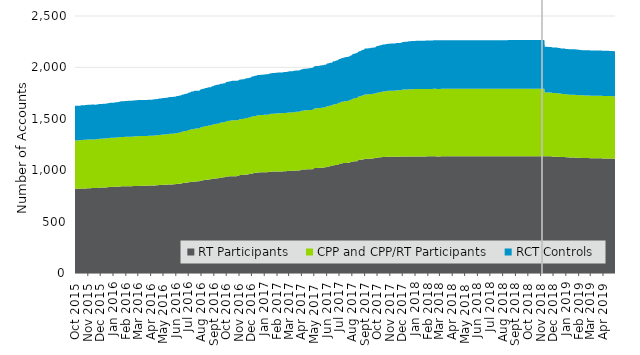
| Category | RT Participants | CPP and CPP/RT Participants | RCT Controls |
|---|---|---|---|
| 2015-10-01 | 819 | 470 | 337 |
| 2015-10-02 | 819 | 470 | 337 |
| 2015-10-03 | 820 | 470 | 337 |
| 2015-10-04 | 820 | 470 | 337 |
| 2015-10-05 | 819 | 470 | 337 |
| 2015-10-06 | 819 | 470 | 337 |
| 2015-10-07 | 820 | 470 | 337 |
| 2015-10-08 | 820 | 470 | 337 |
| 2015-10-09 | 821 | 470 | 337 |
| 2015-10-10 | 821 | 470 | 337 |
| 2015-10-11 | 821 | 470 | 337 |
| 2015-10-12 | 821 | 470 | 337 |
| 2015-10-13 | 821 | 470 | 337 |
| 2015-10-14 | 821 | 470 | 337 |
| 2015-10-15 | 822 | 470 | 337 |
| 2015-10-16 | 822 | 472 | 337 |
| 2015-10-17 | 822 | 472 | 337 |
| 2015-10-18 | 822 | 472 | 337 |
| 2015-10-19 | 822 | 472 | 337 |
| 2015-10-20 | 822 | 472 | 337 |
| 2015-10-21 | 823 | 472 | 337 |
| 2015-10-22 | 823 | 472 | 337 |
| 2015-10-23 | 823 | 472 | 337 |
| 2015-10-24 | 823 | 473 | 337 |
| 2015-10-25 | 823 | 473 | 337 |
| 2015-10-26 | 823 | 473 | 337 |
| 2015-10-27 | 823 | 473 | 338 |
| 2015-10-28 | 823 | 473 | 338 |
| 2015-10-29 | 823 | 473 | 338 |
| 2015-10-30 | 823 | 473 | 338 |
| 2015-10-31 | 825 | 473 | 338 |
| 2015-11-01 | 825 | 473 | 338 |
| 2015-11-02 | 825 | 473 | 338 |
| 2015-11-03 | 825 | 473 | 339 |
| 2015-11-04 | 825 | 473 | 339 |
| 2015-11-05 | 825 | 473 | 339 |
| 2015-11-06 | 825 | 473 | 339 |
| 2015-11-07 | 825 | 473 | 339 |
| 2015-11-08 | 825 | 473 | 339 |
| 2015-11-09 | 825 | 473 | 339 |
| 2015-11-10 | 826 | 473 | 339 |
| 2015-11-11 | 826 | 473 | 339 |
| 2015-11-12 | 826 | 473 | 339 |
| 2015-11-13 | 826 | 473 | 339 |
| 2015-11-14 | 826 | 473 | 339 |
| 2015-11-15 | 826 | 473 | 339 |
| 2015-11-16 | 826 | 473 | 339 |
| 2015-11-17 | 826 | 473 | 339 |
| 2015-11-18 | 826 | 473 | 338 |
| 2015-11-19 | 826 | 473 | 338 |
| 2015-11-20 | 826 | 473 | 338 |
| 2015-11-21 | 826 | 474 | 338 |
| 2015-11-22 | 826 | 474 | 338 |
| 2015-11-23 | 826 | 474 | 338 |
| 2015-11-24 | 826 | 474 | 338 |
| 2015-11-25 | 827 | 474 | 338 |
| 2015-11-26 | 829 | 474 | 338 |
| 2015-11-27 | 830 | 474 | 338 |
| 2015-11-28 | 830 | 475 | 338 |
| 2015-11-29 | 830 | 475 | 338 |
| 2015-11-30 | 830 | 475 | 338 |
| 2015-12-01 | 831 | 476 | 338 |
| 2015-12-02 | 831 | 476 | 338 |
| 2015-12-03 | 831 | 476 | 338 |
| 2015-12-04 | 831 | 476 | 338 |
| 2015-12-05 | 831 | 476 | 338 |
| 2015-12-06 | 831 | 476 | 338 |
| 2015-12-07 | 831 | 476 | 338 |
| 2015-12-08 | 832 | 476 | 339 |
| 2015-12-09 | 832 | 476 | 339 |
| 2015-12-10 | 832 | 476 | 339 |
| 2015-12-11 | 832 | 476 | 339 |
| 2015-12-12 | 832 | 476 | 339 |
| 2015-12-13 | 832 | 476 | 339 |
| 2015-12-14 | 832 | 476 | 339 |
| 2015-12-15 | 832 | 476 | 339 |
| 2015-12-16 | 833 | 476 | 339 |
| 2015-12-17 | 834 | 476 | 339 |
| 2015-12-18 | 835 | 476 | 339 |
| 2015-12-19 | 835 | 477 | 339 |
| 2015-12-20 | 835 | 477 | 339 |
| 2015-12-21 | 835 | 477 | 339 |
| 2015-12-22 | 836 | 477 | 340 |
| 2015-12-23 | 836 | 477 | 340 |
| 2015-12-24 | 837 | 477 | 341 |
| 2015-12-25 | 838 | 477 | 341 |
| 2015-12-26 | 838 | 477 | 341 |
| 2015-12-27 | 838 | 477 | 341 |
| 2015-12-28 | 838 | 477 | 341 |
| 2015-12-29 | 838 | 477 | 341 |
| 2015-12-30 | 838 | 477 | 341 |
| 2015-12-31 | 838 | 477 | 341 |
| 2016-01-01 | 838 | 477 | 341 |
| 2016-01-02 | 838 | 477 | 341 |
| 2016-01-03 | 838 | 477 | 341 |
| 2016-01-04 | 838 | 477 | 341 |
| 2016-01-05 | 839 | 477 | 343 |
| 2016-01-06 | 839 | 477 | 344 |
| 2016-01-07 | 839 | 477 | 344 |
| 2016-01-08 | 839 | 478 | 344 |
| 2016-01-09 | 839 | 479 | 344 |
| 2016-01-10 | 839 | 479 | 344 |
| 2016-01-11 | 839 | 479 | 344 |
| 2016-01-12 | 839 | 479 | 344 |
| 2016-01-13 | 839 | 479 | 344 |
| 2016-01-14 | 840 | 479 | 344 |
| 2016-01-15 | 840 | 480 | 344 |
| 2016-01-16 | 841 | 481 | 345 |
| 2016-01-17 | 841 | 481 | 345 |
| 2016-01-18 | 841 | 481 | 345 |
| 2016-01-19 | 842 | 481 | 346 |
| 2016-01-20 | 843 | 481 | 346 |
| 2016-01-21 | 843 | 481 | 347 |
| 2016-01-22 | 843 | 481 | 347 |
| 2016-01-23 | 843 | 481 | 347 |
| 2016-01-24 | 843 | 481 | 347 |
| 2016-01-25 | 843 | 481 | 347 |
| 2016-01-26 | 843 | 481 | 347 |
| 2016-01-27 | 843 | 481 | 347 |
| 2016-01-28 | 843 | 481 | 347 |
| 2016-01-29 | 843 | 481 | 347 |
| 2016-01-30 | 843 | 482 | 349 |
| 2016-01-31 | 843 | 482 | 349 |
| 2016-02-01 | 843 | 482 | 349 |
| 2016-02-02 | 843 | 482 | 349 |
| 2016-02-03 | 843 | 482 | 349 |
| 2016-02-04 | 843 | 482 | 349 |
| 2016-02-05 | 843 | 482 | 349 |
| 2016-02-06 | 844 | 482 | 349 |
| 2016-02-07 | 844 | 482 | 349 |
| 2016-02-08 | 844 | 482 | 349 |
| 2016-02-09 | 844 | 482 | 349 |
| 2016-02-10 | 844 | 482 | 349 |
| 2016-02-11 | 844 | 482 | 349 |
| 2016-02-12 | 844 | 482 | 350 |
| 2016-02-13 | 844 | 482 | 350 |
| 2016-02-14 | 844 | 482 | 350 |
| 2016-02-15 | 844 | 482 | 350 |
| 2016-02-16 | 844 | 482 | 350 |
| 2016-02-17 | 845 | 482 | 350 |
| 2016-02-18 | 846 | 482 | 350 |
| 2016-02-19 | 846 | 482 | 350 |
| 2016-02-20 | 846 | 482 | 350 |
| 2016-02-21 | 846 | 482 | 350 |
| 2016-02-22 | 846 | 482 | 350 |
| 2016-02-23 | 847 | 482 | 350 |
| 2016-02-24 | 847 | 483 | 350 |
| 2016-02-25 | 847 | 483 | 350 |
| 2016-02-26 | 847 | 483 | 351 |
| 2016-02-27 | 847 | 483 | 351 |
| 2016-02-28 | 847 | 483 | 351 |
| 2016-02-29 | 847 | 483 | 351 |
| 2016-03-01 | 847 | 484 | 351 |
| 2016-03-02 | 847 | 484 | 351 |
| 2016-03-03 | 847 | 484 | 351 |
| 2016-03-04 | 847 | 484 | 351 |
| 2016-03-05 | 848 | 484 | 351 |
| 2016-03-06 | 848 | 484 | 351 |
| 2016-03-07 | 848 | 484 | 351 |
| 2016-03-08 | 848 | 484 | 351 |
| 2016-03-09 | 848 | 484 | 351 |
| 2016-03-10 | 848 | 484 | 351 |
| 2016-03-11 | 848 | 484 | 351 |
| 2016-03-12 | 848 | 484 | 351 |
| 2016-03-13 | 848 | 484 | 351 |
| 2016-03-14 | 848 | 484 | 351 |
| 2016-03-15 | 848 | 484 | 351 |
| 2016-03-16 | 848 | 484 | 351 |
| 2016-03-17 | 848 | 484 | 351 |
| 2016-03-18 | 848 | 484 | 351 |
| 2016-03-19 | 848 | 484 | 351 |
| 2016-03-20 | 848 | 484 | 351 |
| 2016-03-21 | 848 | 484 | 351 |
| 2016-03-22 | 848 | 484 | 351 |
| 2016-03-23 | 848 | 484 | 351 |
| 2016-03-24 | 848 | 484 | 351 |
| 2016-03-25 | 850 | 484 | 351 |
| 2016-03-26 | 850 | 484 | 351 |
| 2016-03-27 | 850 | 484 | 351 |
| 2016-03-28 | 850 | 484 | 351 |
| 2016-03-29 | 850 | 484 | 351 |
| 2016-03-30 | 850 | 484 | 351 |
| 2016-03-31 | 850 | 484 | 351 |
| 2016-04-01 | 851 | 484 | 351 |
| 2016-04-02 | 851 | 484 | 351 |
| 2016-04-03 | 851 | 484 | 351 |
| 2016-04-04 | 851 | 484 | 351 |
| 2016-04-05 | 851 | 484 | 351 |
| 2016-04-06 | 852 | 484 | 351 |
| 2016-04-07 | 852 | 484 | 351 |
| 2016-04-08 | 852 | 485 | 352 |
| 2016-04-09 | 852 | 485 | 352 |
| 2016-04-10 | 852 | 485 | 352 |
| 2016-04-11 | 852 | 485 | 352 |
| 2016-04-12 | 852 | 485 | 352 |
| 2016-04-13 | 852 | 485 | 352 |
| 2016-04-14 | 853 | 486 | 352 |
| 2016-04-15 | 853 | 486 | 352 |
| 2016-04-16 | 854 | 487 | 352 |
| 2016-04-17 | 854 | 487 | 352 |
| 2016-04-18 | 854 | 487 | 352 |
| 2016-04-19 | 854 | 487 | 353 |
| 2016-04-20 | 854 | 487 | 353 |
| 2016-04-21 | 856 | 487 | 353 |
| 2016-04-22 | 856 | 487 | 354 |
| 2016-04-23 | 856 | 487 | 354 |
| 2016-04-24 | 856 | 487 | 354 |
| 2016-04-25 | 856 | 487 | 354 |
| 2016-04-26 | 857 | 487 | 354 |
| 2016-04-27 | 857 | 487 | 354 |
| 2016-04-28 | 858 | 487 | 354 |
| 2016-04-29 | 858 | 488 | 354 |
| 2016-04-30 | 858 | 489 | 355 |
| 2016-05-01 | 858 | 489 | 355 |
| 2016-05-02 | 858 | 489 | 355 |
| 2016-05-03 | 858 | 489 | 355 |
| 2016-05-04 | 858 | 489 | 355 |
| 2016-05-05 | 858 | 489 | 355 |
| 2016-05-06 | 859 | 489 | 355 |
| 2016-05-07 | 859 | 489 | 356 |
| 2016-05-08 | 859 | 489 | 356 |
| 2016-05-09 | 859 | 489 | 356 |
| 2016-05-10 | 859 | 490 | 356 |
| 2016-05-11 | 859 | 490 | 356 |
| 2016-05-12 | 859 | 490 | 356 |
| 2016-05-13 | 860 | 491 | 356 |
| 2016-05-14 | 862 | 491 | 356 |
| 2016-05-15 | 862 | 491 | 356 |
| 2016-05-16 | 862 | 491 | 356 |
| 2016-05-17 | 862 | 493 | 357 |
| 2016-05-18 | 862 | 493 | 357 |
| 2016-05-19 | 862 | 493 | 357 |
| 2016-05-20 | 862 | 493 | 358 |
| 2016-05-21 | 862 | 493 | 358 |
| 2016-05-22 | 862 | 493 | 358 |
| 2016-05-23 | 862 | 493 | 358 |
| 2016-05-24 | 862 | 493 | 358 |
| 2016-05-25 | 862 | 493 | 358 |
| 2016-05-26 | 863 | 493 | 358 |
| 2016-05-27 | 863 | 493 | 358 |
| 2016-05-28 | 864 | 493 | 358 |
| 2016-05-29 | 864 | 493 | 358 |
| 2016-05-30 | 864 | 493 | 358 |
| 2016-05-31 | 864 | 493 | 358 |
| 2016-06-01 | 866 | 493 | 358 |
| 2016-06-02 | 866 | 495 | 359 |
| 2016-06-03 | 866 | 495 | 359 |
| 2016-06-04 | 867 | 495 | 359 |
| 2016-06-05 | 867 | 495 | 359 |
| 2016-06-06 | 867 | 495 | 359 |
| 2016-06-07 | 867 | 496 | 359 |
| 2016-06-08 | 867 | 497 | 359 |
| 2016-06-09 | 868 | 497 | 360 |
| 2016-06-10 | 868 | 498 | 360 |
| 2016-06-11 | 868 | 499 | 360 |
| 2016-06-12 | 868 | 499 | 360 |
| 2016-06-13 | 868 | 499 | 360 |
| 2016-06-14 | 869 | 499 | 360 |
| 2016-06-15 | 870 | 500 | 360 |
| 2016-06-16 | 873 | 501 | 360 |
| 2016-06-17 | 874 | 501 | 360 |
| 2016-06-18 | 875 | 501 | 360 |
| 2016-06-19 | 875 | 501 | 360 |
| 2016-06-20 | 875 | 501 | 360 |
| 2016-06-21 | 876 | 502 | 360 |
| 2016-06-22 | 877 | 503 | 360 |
| 2016-06-23 | 877 | 504 | 360 |
| 2016-06-24 | 877 | 504 | 362 |
| 2016-06-25 | 878 | 504 | 362 |
| 2016-06-26 | 878 | 504 | 362 |
| 2016-06-27 | 878 | 504 | 362 |
| 2016-06-28 | 879 | 504 | 362 |
| 2016-06-29 | 879 | 504 | 363 |
| 2016-06-30 | 881 | 505 | 363 |
| 2016-07-01 | 883 | 507 | 364 |
| 2016-07-02 | 883 | 507 | 364 |
| 2016-07-03 | 883 | 507 | 364 |
| 2016-07-04 | 883 | 507 | 364 |
| 2016-07-05 | 885 | 509 | 364 |
| 2016-07-06 | 885 | 510 | 364 |
| 2016-07-07 | 885 | 510 | 364 |
| 2016-07-08 | 886 | 511 | 366 |
| 2016-07-09 | 887 | 511 | 368 |
| 2016-07-10 | 887 | 511 | 368 |
| 2016-07-11 | 887 | 511 | 368 |
| 2016-07-12 | 887 | 511 | 368 |
| 2016-07-13 | 887 | 511 | 368 |
| 2016-07-14 | 887 | 512 | 368 |
| 2016-07-15 | 888 | 512 | 368 |
| 2016-07-16 | 890 | 514 | 368 |
| 2016-07-17 | 890 | 514 | 368 |
| 2016-07-18 | 890 | 514 | 368 |
| 2016-07-19 | 891 | 514 | 368 |
| 2016-07-20 | 891 | 514 | 368 |
| 2016-07-21 | 891 | 514 | 368 |
| 2016-07-22 | 891 | 514 | 368 |
| 2016-07-23 | 892 | 513 | 368 |
| 2016-07-24 | 892 | 513 | 368 |
| 2016-07-25 | 892 | 513 | 368 |
| 2016-07-26 | 892 | 513 | 368 |
| 2016-07-27 | 892 | 513 | 368 |
| 2016-07-28 | 893 | 513 | 368 |
| 2016-07-29 | 893 | 516 | 368 |
| 2016-07-30 | 897 | 518 | 369 |
| 2016-07-31 | 897 | 518 | 369 |
| 2016-08-01 | 898 | 519 | 369 |
| 2016-08-02 | 898 | 519 | 369 |
| 2016-08-03 | 901 | 519 | 369 |
| 2016-08-04 | 901 | 519 | 369 |
| 2016-08-05 | 903 | 519 | 370 |
| 2016-08-06 | 903 | 519 | 370 |
| 2016-08-07 | 903 | 519 | 370 |
| 2016-08-08 | 903 | 519 | 370 |
| 2016-08-09 | 905 | 519 | 370 |
| 2016-08-10 | 906 | 520 | 370 |
| 2016-08-11 | 906 | 522 | 370 |
| 2016-08-12 | 907 | 522 | 370 |
| 2016-08-13 | 907 | 522 | 370 |
| 2016-08-14 | 907 | 522 | 370 |
| 2016-08-15 | 907 | 522 | 370 |
| 2016-08-16 | 908 | 523 | 372 |
| 2016-08-17 | 908 | 523 | 372 |
| 2016-08-18 | 910 | 523 | 372 |
| 2016-08-19 | 910 | 524 | 372 |
| 2016-08-20 | 910 | 524 | 372 |
| 2016-08-21 | 910 | 524 | 372 |
| 2016-08-22 | 910 | 524 | 372 |
| 2016-08-23 | 912 | 524 | 372 |
| 2016-08-24 | 912 | 524 | 372 |
| 2016-08-25 | 912 | 524 | 372 |
| 2016-08-26 | 913 | 525 | 373 |
| 2016-08-27 | 916 | 526 | 374 |
| 2016-08-28 | 916 | 526 | 374 |
| 2016-08-29 | 916 | 526 | 374 |
| 2016-08-30 | 916 | 526 | 374 |
| 2016-08-31 | 918 | 526 | 374 |
| 2016-09-01 | 918 | 529 | 375 |
| 2016-09-02 | 919 | 530 | 377 |
| 2016-09-03 | 920 | 530 | 377 |
| 2016-09-04 | 920 | 530 | 377 |
| 2016-09-05 | 920 | 530 | 377 |
| 2016-09-06 | 920 | 530 | 377 |
| 2016-09-07 | 920 | 530 | 378 |
| 2016-09-08 | 922 | 530 | 378 |
| 2016-09-09 | 922 | 530 | 379 |
| 2016-09-10 | 922 | 531 | 379 |
| 2016-09-11 | 922 | 531 | 379 |
| 2016-09-12 | 922 | 531 | 379 |
| 2016-09-13 | 923 | 532 | 379 |
| 2016-09-14 | 923 | 532 | 379 |
| 2016-09-15 | 924 | 532 | 379 |
| 2016-09-16 | 925 | 533 | 379 |
| 2016-09-17 | 929 | 534 | 379 |
| 2016-09-18 | 929 | 534 | 379 |
| 2016-09-19 | 929 | 534 | 379 |
| 2016-09-20 | 929 | 534 | 379 |
| 2016-09-21 | 929 | 534 | 379 |
| 2016-09-22 | 929 | 534 | 379 |
| 2016-09-23 | 929 | 534 | 379 |
| 2016-09-24 | 932 | 534 | 379 |
| 2016-09-25 | 932 | 534 | 379 |
| 2016-09-26 | 932 | 534 | 379 |
| 2016-09-27 | 932 | 534 | 379 |
| 2016-09-28 | 933 | 535 | 379 |
| 2016-09-29 | 933 | 535 | 379 |
| 2016-09-30 | 938 | 535 | 381 |
| 2016-10-01 | 939 | 538 | 381 |
| 2016-10-02 | 939 | 538 | 381 |
| 2016-10-03 | 939 | 538 | 381 |
| 2016-10-04 | 939 | 539 | 381 |
| 2016-10-05 | 939 | 540 | 381 |
| 2016-10-06 | 939 | 540 | 382 |
| 2016-10-07 | 940 | 540 | 383 |
| 2016-10-08 | 941 | 540 | 383 |
| 2016-10-09 | 941 | 540 | 383 |
| 2016-10-10 | 941 | 540 | 383 |
| 2016-10-11 | 941 | 540 | 383 |
| 2016-10-12 | 941 | 541 | 383 |
| 2016-10-13 | 941 | 542 | 384 |
| 2016-10-14 | 942 | 542 | 384 |
| 2016-10-15 | 942 | 543 | 384 |
| 2016-10-16 | 942 | 543 | 384 |
| 2016-10-17 | 942 | 543 | 384 |
| 2016-10-18 | 942 | 543 | 384 |
| 2016-10-19 | 942 | 543 | 384 |
| 2016-10-20 | 942 | 543 | 384 |
| 2016-10-21 | 942 | 543 | 384 |
| 2016-10-22 | 942 | 543 | 384 |
| 2016-10-23 | 942 | 543 | 384 |
| 2016-10-24 | 942 | 543 | 384 |
| 2016-10-25 | 942 | 543 | 384 |
| 2016-10-26 | 942 | 543 | 384 |
| 2016-10-27 | 942 | 543 | 384 |
| 2016-10-28 | 943 | 543 | 384 |
| 2016-10-29 | 945 | 544 | 384 |
| 2016-10-30 | 945 | 544 | 384 |
| 2016-10-31 | 945 | 544 | 384 |
| 2016-11-01 | 950 | 544 | 385 |
| 2016-11-02 | 952 | 544 | 385 |
| 2016-11-03 | 952 | 544 | 385 |
| 2016-11-04 | 953 | 544 | 385 |
| 2016-11-05 | 954 | 544 | 385 |
| 2016-11-06 | 954 | 544 | 385 |
| 2016-11-07 | 954 | 544 | 385 |
| 2016-11-08 | 954 | 544 | 385 |
| 2016-11-09 | 954 | 545 | 385 |
| 2016-11-10 | 954 | 545 | 385 |
| 2016-11-11 | 955 | 545 | 385 |
| 2016-11-12 | 955 | 545 | 385 |
| 2016-11-13 | 955 | 545 | 385 |
| 2016-11-14 | 955 | 545 | 385 |
| 2016-11-15 | 956 | 547 | 386 |
| 2016-11-16 | 957 | 548 | 386 |
| 2016-11-17 | 958 | 548 | 386 |
| 2016-11-18 | 959 | 549 | 386 |
| 2016-11-19 | 959 | 549 | 386 |
| 2016-11-20 | 959 | 549 | 386 |
| 2016-11-21 | 959 | 549 | 386 |
| 2016-11-22 | 959 | 549 | 386 |
| 2016-11-23 | 960 | 549 | 386 |
| 2016-11-24 | 960 | 550 | 386 |
| 2016-11-25 | 962 | 550 | 386 |
| 2016-11-26 | 962 | 551 | 386 |
| 2016-11-27 | 962 | 551 | 386 |
| 2016-11-28 | 962 | 551 | 386 |
| 2016-11-29 | 964 | 552 | 386 |
| 2016-11-30 | 965 | 552 | 386 |
| 2016-12-01 | 967 | 554 | 388 |
| 2016-12-02 | 969 | 554 | 388 |
| 2016-12-03 | 969 | 554 | 389 |
| 2016-12-04 | 969 | 554 | 389 |
| 2016-12-05 | 969 | 554 | 389 |
| 2016-12-06 | 970 | 554 | 389 |
| 2016-12-07 | 972 | 554 | 390 |
| 2016-12-08 | 972 | 554 | 390 |
| 2016-12-09 | 974 | 554 | 390 |
| 2016-12-10 | 974 | 554 | 391 |
| 2016-12-11 | 974 | 554 | 391 |
| 2016-12-12 | 974 | 554 | 391 |
| 2016-12-13 | 975 | 555 | 391 |
| 2016-12-14 | 975 | 555 | 391 |
| 2016-12-15 | 976 | 556 | 391 |
| 2016-12-16 | 978 | 556 | 391 |
| 2016-12-17 | 978 | 556 | 391 |
| 2016-12-18 | 978 | 556 | 391 |
| 2016-12-19 | 978 | 556 | 391 |
| 2016-12-20 | 978 | 556 | 391 |
| 2016-12-21 | 979 | 556 | 391 |
| 2016-12-22 | 979 | 556 | 392 |
| 2016-12-23 | 981 | 556 | 392 |
| 2016-12-24 | 981 | 556 | 392 |
| 2016-12-25 | 981 | 556 | 392 |
| 2016-12-26 | 981 | 556 | 392 |
| 2016-12-27 | 981 | 556 | 392 |
| 2016-12-28 | 981 | 556 | 392 |
| 2016-12-29 | 981 | 556 | 392 |
| 2016-12-30 | 981 | 556 | 392 |
| 2016-12-31 | 981 | 558 | 392 |
| 2017-01-01 | 981 | 558 | 392 |
| 2017-01-02 | 981 | 558 | 392 |
| 2017-01-03 | 981 | 558 | 392 |
| 2017-01-04 | 981 | 558 | 394 |
| 2017-01-05 | 981 | 558 | 394 |
| 2017-01-06 | 981 | 558 | 394 |
| 2017-01-07 | 981 | 558 | 394 |
| 2017-01-08 | 981 | 558 | 394 |
| 2017-01-09 | 981 | 558 | 394 |
| 2017-01-10 | 982 | 558 | 394 |
| 2017-01-11 | 983 | 559 | 394 |
| 2017-01-12 | 983 | 559 | 394 |
| 2017-01-13 | 984 | 559 | 395 |
| 2017-01-14 | 985 | 561 | 395 |
| 2017-01-15 | 985 | 561 | 395 |
| 2017-01-16 | 985 | 561 | 395 |
| 2017-01-17 | 986 | 562 | 395 |
| 2017-01-18 | 986 | 562 | 395 |
| 2017-01-19 | 986 | 562 | 395 |
| 2017-01-20 | 986 | 562 | 395 |
| 2017-01-21 | 987 | 563 | 395 |
| 2017-01-22 | 987 | 563 | 395 |
| 2017-01-23 | 987 | 563 | 395 |
| 2017-01-24 | 987 | 563 | 395 |
| 2017-01-25 | 987 | 563 | 395 |
| 2017-01-26 | 987 | 563 | 395 |
| 2017-01-27 | 987 | 563 | 395 |
| 2017-01-28 | 987 | 564 | 396 |
| 2017-01-29 | 987 | 564 | 396 |
| 2017-01-30 | 987 | 564 | 396 |
| 2017-01-31 | 987 | 564 | 396 |
| 2017-02-01 | 987 | 565 | 396 |
| 2017-02-02 | 988 | 565 | 396 |
| 2017-02-03 | 988 | 566 | 396 |
| 2017-02-04 | 988 | 567 | 396 |
| 2017-02-05 | 988 | 567 | 396 |
| 2017-02-06 | 988 | 567 | 396 |
| 2017-02-07 | 988 | 567 | 396 |
| 2017-02-08 | 988 | 567 | 396 |
| 2017-02-09 | 988 | 567 | 396 |
| 2017-02-10 | 988 | 567 | 396 |
| 2017-02-11 | 988 | 567 | 396 |
| 2017-02-12 | 988 | 567 | 396 |
| 2017-02-13 | 988 | 567 | 396 |
| 2017-02-14 | 988 | 567 | 396 |
| 2017-02-15 | 989 | 567 | 396 |
| 2017-02-16 | 989 | 567 | 396 |
| 2017-02-17 | 990 | 567 | 397 |
| 2017-02-18 | 990 | 567 | 398 |
| 2017-02-19 | 990 | 567 | 398 |
| 2017-02-20 | 990 | 567 | 398 |
| 2017-02-21 | 990 | 567 | 398 |
| 2017-02-22 | 990 | 567 | 398 |
| 2017-02-23 | 990 | 567 | 398 |
| 2017-02-24 | 991 | 567 | 398 |
| 2017-02-25 | 992 | 567 | 398 |
| 2017-02-26 | 992 | 567 | 398 |
| 2017-02-27 | 992 | 567 | 398 |
| 2017-02-28 | 993 | 567 | 398 |
| 2017-03-01 | 994 | 567 | 400 |
| 2017-03-02 | 994 | 567 | 401 |
| 2017-03-03 | 994 | 567 | 402 |
| 2017-03-04 | 994 | 567 | 402 |
| 2017-03-05 | 994 | 567 | 402 |
| 2017-03-06 | 994 | 567 | 402 |
| 2017-03-07 | 994 | 567 | 402 |
| 2017-03-08 | 994 | 567 | 402 |
| 2017-03-09 | 994 | 567 | 402 |
| 2017-03-10 | 994 | 567 | 402 |
| 2017-03-11 | 994 | 568 | 402 |
| 2017-03-12 | 994 | 568 | 402 |
| 2017-03-13 | 994 | 568 | 402 |
| 2017-03-14 | 995 | 569 | 402 |
| 2017-03-15 | 995 | 571 | 402 |
| 2017-03-16 | 995 | 571 | 402 |
| 2017-03-17 | 995 | 571 | 402 |
| 2017-03-18 | 997 | 571 | 402 |
| 2017-03-19 | 997 | 571 | 402 |
| 2017-03-20 | 997 | 571 | 402 |
| 2017-03-21 | 998 | 571 | 402 |
| 2017-03-22 | 998 | 571 | 402 |
| 2017-03-23 | 998 | 571 | 402 |
| 2017-03-24 | 998 | 571 | 402 |
| 2017-03-25 | 998 | 571 | 402 |
| 2017-03-26 | 998 | 571 | 402 |
| 2017-03-27 | 998 | 571 | 402 |
| 2017-03-28 | 1000 | 572 | 402 |
| 2017-03-29 | 1000 | 572 | 402 |
| 2017-03-30 | 1000 | 572 | 403 |
| 2017-03-31 | 1002 | 572 | 404 |
| 2017-04-01 | 1006 | 572 | 404 |
| 2017-04-02 | 1006 | 572 | 404 |
| 2017-04-03 | 1006 | 572 | 404 |
| 2017-04-04 | 1006 | 572 | 405 |
| 2017-04-05 | 1006 | 572 | 405 |
| 2017-04-06 | 1007 | 572 | 406 |
| 2017-04-07 | 1008 | 573 | 406 |
| 2017-04-08 | 1008 | 574 | 406 |
| 2017-04-09 | 1008 | 574 | 406 |
| 2017-04-10 | 1008 | 574 | 406 |
| 2017-04-11 | 1008 | 574 | 406 |
| 2017-04-12 | 1008 | 574 | 406 |
| 2017-04-13 | 1008 | 574 | 406 |
| 2017-04-14 | 1009 | 574 | 407 |
| 2017-04-15 | 1009 | 574 | 407 |
| 2017-04-16 | 1009 | 574 | 407 |
| 2017-04-17 | 1009 | 574 | 407 |
| 2017-04-18 | 1009 | 574 | 407 |
| 2017-04-19 | 1009 | 575 | 407 |
| 2017-04-20 | 1010 | 575 | 407 |
| 2017-04-21 | 1010 | 575 | 407 |
| 2017-04-22 | 1010 | 575 | 408 |
| 2017-04-23 | 1010 | 575 | 408 |
| 2017-04-24 | 1010 | 575 | 408 |
| 2017-04-25 | 1010 | 575 | 409 |
| 2017-04-26 | 1010 | 575 | 409 |
| 2017-04-27 | 1010 | 576 | 409 |
| 2017-04-28 | 1010 | 578 | 409 |
| 2017-04-29 | 1013 | 579 | 409 |
| 2017-04-30 | 1013 | 579 | 409 |
| 2017-05-01 | 1013 | 579 | 409 |
| 2017-05-02 | 1021 | 579 | 411 |
| 2017-05-03 | 1021 | 579 | 411 |
| 2017-05-04 | 1021 | 579 | 411 |
| 2017-05-05 | 1022 | 579 | 411 |
| 2017-05-06 | 1022 | 580 | 411 |
| 2017-05-07 | 1022 | 580 | 411 |
| 2017-05-08 | 1022 | 580 | 411 |
| 2017-05-09 | 1022 | 580 | 411 |
| 2017-05-10 | 1022 | 580 | 411 |
| 2017-05-11 | 1022 | 580 | 411 |
| 2017-05-12 | 1022 | 581 | 411 |
| 2017-05-13 | 1023 | 581 | 411 |
| 2017-05-14 | 1023 | 581 | 411 |
| 2017-05-15 | 1023 | 581 | 411 |
| 2017-05-16 | 1024 | 581 | 412 |
| 2017-05-17 | 1025 | 581 | 412 |
| 2017-05-18 | 1025 | 581 | 412 |
| 2017-05-19 | 1025 | 581 | 413 |
| 2017-05-20 | 1025 | 582 | 413 |
| 2017-05-21 | 1025 | 582 | 413 |
| 2017-05-22 | 1025 | 582 | 413 |
| 2017-05-23 | 1025 | 582 | 413 |
| 2017-05-24 | 1025 | 583 | 413 |
| 2017-05-25 | 1026 | 583 | 413 |
| 2017-05-26 | 1027 | 584 | 414 |
| 2017-05-27 | 1028 | 584 | 414 |
| 2017-05-28 | 1028 | 584 | 414 |
| 2017-05-29 | 1028 | 584 | 414 |
| 2017-05-30 | 1028 | 584 | 414 |
| 2017-05-31 | 1029 | 584 | 414 |
| 2017-06-01 | 1034 | 586 | 416 |
| 2017-06-02 | 1036 | 587 | 416 |
| 2017-06-03 | 1036 | 587 | 416 |
| 2017-06-04 | 1036 | 587 | 416 |
| 2017-06-05 | 1036 | 587 | 416 |
| 2017-06-06 | 1036 | 589 | 416 |
| 2017-06-07 | 1036 | 589 | 416 |
| 2017-06-08 | 1037 | 589 | 416 |
| 2017-06-09 | 1039 | 589 | 416 |
| 2017-06-10 | 1040 | 589 | 416 |
| 2017-06-11 | 1040 | 589 | 416 |
| 2017-06-12 | 1040 | 589 | 416 |
| 2017-06-13 | 1040 | 589 | 416 |
| 2017-06-14 | 1040 | 589 | 417 |
| 2017-06-15 | 1041 | 589 | 418 |
| 2017-06-16 | 1047 | 592 | 419 |
| 2017-06-17 | 1047 | 592 | 420 |
| 2017-06-18 | 1047 | 592 | 420 |
| 2017-06-19 | 1047 | 592 | 420 |
| 2017-06-20 | 1048 | 592 | 420 |
| 2017-06-21 | 1049 | 592 | 420 |
| 2017-06-22 | 1050 | 592 | 421 |
| 2017-06-23 | 1050 | 593 | 421 |
| 2017-06-24 | 1051 | 593 | 422 |
| 2017-06-25 | 1051 | 593 | 422 |
| 2017-06-26 | 1051 | 593 | 422 |
| 2017-06-27 | 1052 | 596 | 422 |
| 2017-06-28 | 1053 | 596 | 422 |
| 2017-06-29 | 1053 | 596 | 423 |
| 2017-06-30 | 1057 | 597 | 423 |
| 2017-07-01 | 1060 | 597 | 424 |
| 2017-07-02 | 1060 | 597 | 424 |
| 2017-07-03 | 1060 | 597 | 424 |
| 2017-07-04 | 1060 | 597 | 424 |
| 2017-07-05 | 1063 | 598 | 424 |
| 2017-07-06 | 1065 | 598 | 424 |
| 2017-07-07 | 1066 | 598 | 425 |
| 2017-07-08 | 1068 | 598 | 426 |
| 2017-07-09 | 1068 | 598 | 426 |
| 2017-07-10 | 1068 | 598 | 426 |
| 2017-07-11 | 1069 | 598 | 426 |
| 2017-07-12 | 1069 | 598 | 426 |
| 2017-07-13 | 1070 | 598 | 426 |
| 2017-07-14 | 1071 | 599 | 426 |
| 2017-07-15 | 1071 | 600 | 428 |
| 2017-07-16 | 1071 | 600 | 428 |
| 2017-07-17 | 1071 | 600 | 428 |
| 2017-07-18 | 1071 | 602 | 428 |
| 2017-07-19 | 1071 | 603 | 428 |
| 2017-07-20 | 1071 | 603 | 428 |
| 2017-07-21 | 1071 | 603 | 428 |
| 2017-07-22 | 1072 | 603 | 428 |
| 2017-07-23 | 1072 | 603 | 428 |
| 2017-07-24 | 1072 | 603 | 428 |
| 2017-07-25 | 1073 | 604 | 428 |
| 2017-07-26 | 1073 | 604 | 429 |
| 2017-07-27 | 1076 | 604 | 430 |
| 2017-07-28 | 1077 | 604 | 430 |
| 2017-07-29 | 1079 | 607 | 430 |
| 2017-07-30 | 1079 | 607 | 430 |
| 2017-07-31 | 1079 | 607 | 430 |
| 2017-08-01 | 1081 | 609 | 430 |
| 2017-08-02 | 1084 | 609 | 433 |
| 2017-08-03 | 1084 | 609 | 433 |
| 2017-08-04 | 1085 | 612 | 434 |
| 2017-08-05 | 1086 | 612 | 434 |
| 2017-08-06 | 1086 | 612 | 434 |
| 2017-08-07 | 1086 | 612 | 434 |
| 2017-08-08 | 1086 | 612 | 434 |
| 2017-08-09 | 1088 | 614 | 434 |
| 2017-08-10 | 1088 | 614 | 434 |
| 2017-08-11 | 1088 | 615 | 434 |
| 2017-08-12 | 1088 | 615 | 436 |
| 2017-08-13 | 1088 | 615 | 436 |
| 2017-08-14 | 1088 | 615 | 436 |
| 2017-08-15 | 1092 | 616 | 436 |
| 2017-08-16 | 1096 | 616 | 437 |
| 2017-08-17 | 1100 | 617 | 437 |
| 2017-08-18 | 1100 | 617 | 438 |
| 2017-08-19 | 1101 | 617 | 440 |
| 2017-08-20 | 1101 | 617 | 440 |
| 2017-08-21 | 1101 | 617 | 440 |
| 2017-08-22 | 1101 | 619 | 440 |
| 2017-08-23 | 1102 | 619 | 440 |
| 2017-08-24 | 1102 | 620 | 441 |
| 2017-08-25 | 1104 | 622 | 441 |
| 2017-08-26 | 1105 | 622 | 442 |
| 2017-08-27 | 1105 | 622 | 442 |
| 2017-08-28 | 1105 | 622 | 442 |
| 2017-08-29 | 1105 | 623 | 443 |
| 2017-08-30 | 1106 | 623 | 443 |
| 2017-08-31 | 1108 | 623 | 444 |
| 2017-09-01 | 1112 | 624 | 446 |
| 2017-09-02 | 1112 | 624 | 447 |
| 2017-09-03 | 1112 | 624 | 447 |
| 2017-09-04 | 1112 | 624 | 447 |
| 2017-09-05 | 1112 | 624 | 447 |
| 2017-09-06 | 1112 | 624 | 447 |
| 2017-09-07 | 1112 | 624 | 447 |
| 2017-09-08 | 1112 | 624 | 447 |
| 2017-09-09 | 1112 | 627 | 447 |
| 2017-09-10 | 1112 | 627 | 447 |
| 2017-09-11 | 1112 | 627 | 447 |
| 2017-09-12 | 1112 | 627 | 447 |
| 2017-09-13 | 1112 | 627 | 447 |
| 2017-09-14 | 1112 | 627 | 447 |
| 2017-09-15 | 1113 | 628 | 447 |
| 2017-09-16 | 1113 | 629 | 448 |
| 2017-09-17 | 1113 | 629 | 448 |
| 2017-09-18 | 1113 | 629 | 448 |
| 2017-09-19 | 1113 | 629 | 448 |
| 2017-09-20 | 1113 | 629 | 448 |
| 2017-09-21 | 1114 | 629 | 448 |
| 2017-09-22 | 1115 | 629 | 448 |
| 2017-09-23 | 1116 | 629 | 449 |
| 2017-09-24 | 1116 | 629 | 449 |
| 2017-09-25 | 1116 | 629 | 449 |
| 2017-09-26 | 1118 | 629 | 450 |
| 2017-09-27 | 1118 | 629 | 450 |
| 2017-09-28 | 1118 | 629 | 450 |
| 2017-09-29 | 1120 | 629 | 453 |
| 2017-09-30 | 1122 | 631 | 454 |
| 2017-10-01 | 1122 | 631 | 454 |
| 2017-10-02 | 1122 | 631 | 454 |
| 2017-10-03 | 1123 | 631 | 454 |
| 2017-10-04 | 1123 | 631 | 454 |
| 2017-10-05 | 1123 | 632 | 455 |
| 2017-10-06 | 1123 | 633 | 455 |
| 2017-10-07 | 1126 | 633 | 456 |
| 2017-10-08 | 1126 | 633 | 456 |
| 2017-10-09 | 1126 | 633 | 456 |
| 2017-10-10 | 1126 | 633 | 456 |
| 2017-10-11 | 1126 | 634 | 456 |
| 2017-10-12 | 1127 | 634 | 456 |
| 2017-10-13 | 1127 | 634 | 456 |
| 2017-10-14 | 1129 | 637 | 456 |
| 2017-10-15 | 1129 | 637 | 456 |
| 2017-10-16 | 1129 | 637 | 456 |
| 2017-10-17 | 1129 | 637 | 456 |
| 2017-10-18 | 1129 | 637 | 456 |
| 2017-10-19 | 1129 | 637 | 456 |
| 2017-10-20 | 1129 | 637 | 457 |
| 2017-10-21 | 1129 | 640 | 457 |
| 2017-10-22 | 1129 | 640 | 457 |
| 2017-10-23 | 1129 | 640 | 457 |
| 2017-10-24 | 1130 | 640 | 457 |
| 2017-10-25 | 1130 | 640 | 457 |
| 2017-10-26 | 1130 | 641 | 457 |
| 2017-10-27 | 1131 | 641 | 458 |
| 2017-10-28 | 1131 | 641 | 458 |
| 2017-10-29 | 1131 | 641 | 458 |
| 2017-10-30 | 1131 | 641 | 458 |
| 2017-10-31 | 1131 | 642 | 458 |
| 2017-11-01 | 1131 | 642 | 458 |
| 2017-11-02 | 1131 | 642 | 458 |
| 2017-11-03 | 1131 | 642 | 459 |
| 2017-11-04 | 1131 | 643 | 459 |
| 2017-11-05 | 1131 | 643 | 459 |
| 2017-11-06 | 1131 | 643 | 459 |
| 2017-11-07 | 1131 | 643 | 459 |
| 2017-11-08 | 1131 | 643 | 459 |
| 2017-11-09 | 1131 | 643 | 459 |
| 2017-11-10 | 1131 | 643 | 459 |
| 2017-11-11 | 1131 | 643 | 459 |
| 2017-11-12 | 1131 | 643 | 459 |
| 2017-11-13 | 1131 | 643 | 459 |
| 2017-11-14 | 1131 | 643 | 459 |
| 2017-11-15 | 1131 | 644 | 459 |
| 2017-11-16 | 1131 | 646 | 459 |
| 2017-11-17 | 1132 | 646 | 459 |
| 2017-11-18 | 1132 | 646 | 459 |
| 2017-11-19 | 1132 | 646 | 459 |
| 2017-11-20 | 1132 | 646 | 459 |
| 2017-11-21 | 1132 | 646 | 460 |
| 2017-11-22 | 1132 | 646 | 460 |
| 2017-11-23 | 1132 | 646 | 460 |
| 2017-11-24 | 1132 | 646 | 460 |
| 2017-11-25 | 1132 | 646 | 460 |
| 2017-11-26 | 1132 | 646 | 460 |
| 2017-11-27 | 1132 | 646 | 460 |
| 2017-11-28 | 1133 | 646 | 460 |
| 2017-11-29 | 1133 | 646 | 460 |
| 2017-11-30 | 1133 | 649 | 460 |
| 2017-12-01 | 1133 | 651 | 461 |
| 2017-12-02 | 1133 | 652 | 461 |
| 2017-12-03 | 1133 | 652 | 461 |
| 2017-12-04 | 1133 | 652 | 461 |
| 2017-12-05 | 1133 | 652 | 462 |
| 2017-12-06 | 1133 | 652 | 464 |
| 2017-12-07 | 1133 | 652 | 464 |
| 2017-12-08 | 1133 | 652 | 464 |
| 2017-12-09 | 1133 | 653 | 464 |
| 2017-12-10 | 1133 | 653 | 464 |
| 2017-12-11 | 1133 | 653 | 464 |
| 2017-12-12 | 1133 | 653 | 464 |
| 2017-12-13 | 1133 | 653 | 464 |
| 2017-12-14 | 1133 | 653 | 464 |
| 2017-12-15 | 1133 | 653 | 466 |
| 2017-12-16 | 1133 | 654 | 467 |
| 2017-12-17 | 1133 | 654 | 467 |
| 2017-12-18 | 1133 | 654 | 467 |
| 2017-12-19 | 1133 | 654 | 468 |
| 2017-12-20 | 1133 | 654 | 468 |
| 2017-12-21 | 1133 | 654 | 468 |
| 2017-12-22 | 1133 | 654 | 468 |
| 2017-12-23 | 1133 | 654 | 469 |
| 2017-12-24 | 1133 | 654 | 469 |
| 2017-12-25 | 1133 | 654 | 469 |
| 2017-12-26 | 1133 | 654 | 469 |
| 2017-12-27 | 1133 | 654 | 469 |
| 2017-12-28 | 1133 | 655 | 469 |
| 2017-12-29 | 1133 | 655 | 469 |
| 2017-12-30 | 1133 | 656 | 469 |
| 2017-12-31 | 1133 | 656 | 469 |
| 2018-01-01 | 1133 | 656 | 469 |
| 2018-01-02 | 1133 | 656 | 469 |
| 2018-01-03 | 1133 | 656 | 470 |
| 2018-01-04 | 1133 | 656 | 470 |
| 2018-01-05 | 1134 | 656 | 470 |
| 2018-01-06 | 1134 | 656 | 470 |
| 2018-01-07 | 1134 | 656 | 470 |
| 2018-01-08 | 1134 | 656 | 470 |
| 2018-01-09 | 1134 | 656 | 470 |
| 2018-01-10 | 1134 | 656 | 470 |
| 2018-01-11 | 1134 | 656 | 470 |
| 2018-01-12 | 1134 | 656 | 470 |
| 2018-01-13 | 1134 | 656 | 470 |
| 2018-01-14 | 1134 | 656 | 470 |
| 2018-01-15 | 1134 | 656 | 470 |
| 2018-01-16 | 1134 | 656 | 470 |
| 2018-01-17 | 1134 | 656 | 470 |
| 2018-01-18 | 1134 | 656 | 470 |
| 2018-01-19 | 1134 | 656 | 470 |
| 2018-01-20 | 1134 | 656 | 470 |
| 2018-01-21 | 1134 | 656 | 470 |
| 2018-01-22 | 1134 | 656 | 470 |
| 2018-01-23 | 1134 | 656 | 470 |
| 2018-01-24 | 1134 | 656 | 470 |
| 2018-01-25 | 1134 | 656 | 470 |
| 2018-01-26 | 1134 | 656 | 470 |
| 2018-01-27 | 1134 | 656 | 471 |
| 2018-01-28 | 1134 | 656 | 471 |
| 2018-01-29 | 1134 | 656 | 471 |
| 2018-01-30 | 1135 | 656 | 471 |
| 2018-01-31 | 1135 | 656 | 471 |
| 2018-02-01 | 1135 | 656 | 471 |
| 2018-02-02 | 1135 | 656 | 471 |
| 2018-02-03 | 1135 | 656 | 471 |
| 2018-02-04 | 1135 | 656 | 471 |
| 2018-02-05 | 1135 | 656 | 471 |
| 2018-02-06 | 1135 | 656 | 471 |
| 2018-02-07 | 1135 | 656 | 471 |
| 2018-02-08 | 1135 | 656 | 471 |
| 2018-02-09 | 1135 | 656 | 471 |
| 2018-02-10 | 1135 | 656 | 471 |
| 2018-02-11 | 1135 | 656 | 471 |
| 2018-02-12 | 1135 | 656 | 471 |
| 2018-02-13 | 1135 | 656 | 471 |
| 2018-02-14 | 1135 | 657 | 471 |
| 2018-02-15 | 1135 | 657 | 471 |
| 2018-02-16 | 1135 | 657 | 472 |
| 2018-02-17 | 1135 | 657 | 472 |
| 2018-02-18 | 1135 | 657 | 472 |
| 2018-02-19 | 1135 | 657 | 472 |
| 2018-02-20 | 1135 | 657 | 472 |
| 2018-02-21 | 1135 | 657 | 472 |
| 2018-02-22 | 1134 | 657 | 472 |
| 2018-02-23 | 1134 | 657 | 472 |
| 2018-02-24 | 1134 | 657 | 472 |
| 2018-02-25 | 1134 | 657 | 472 |
| 2018-02-26 | 1134 | 657 | 472 |
| 2018-02-27 | 1134 | 657 | 473 |
| 2018-02-28 | 1134 | 657 | 473 |
| 2018-03-01 | 1134 | 657 | 473 |
| 2018-03-02 | 1134 | 657 | 473 |
| 2018-03-03 | 1134 | 657 | 473 |
| 2018-03-04 | 1134 | 657 | 473 |
| 2018-03-05 | 1135 | 657 | 473 |
| 2018-03-06 | 1135 | 657 | 473 |
| 2018-03-07 | 1135 | 657 | 473 |
| 2018-03-08 | 1135 | 657 | 473 |
| 2018-03-09 | 1135 | 657 | 473 |
| 2018-03-10 | 1135 | 657 | 473 |
| 2018-03-11 | 1135 | 657 | 473 |
| 2018-03-12 | 1135 | 657 | 473 |
| 2018-03-13 | 1135 | 657 | 473 |
| 2018-03-14 | 1135 | 657 | 473 |
| 2018-03-15 | 1135 | 657 | 473 |
| 2018-03-16 | 1135 | 657 | 473 |
| 2018-03-17 | 1135 | 657 | 473 |
| 2018-03-18 | 1135 | 657 | 473 |
| 2018-03-19 | 1135 | 657 | 473 |
| 2018-03-20 | 1135 | 657 | 473 |
| 2018-03-21 | 1135 | 657 | 473 |
| 2018-03-22 | 1135 | 657 | 473 |
| 2018-03-23 | 1135 | 657 | 473 |
| 2018-03-24 | 1135 | 657 | 473 |
| 2018-03-25 | 1135 | 657 | 473 |
| 2018-03-26 | 1135 | 657 | 473 |
| 2018-03-27 | 1135 | 657 | 473 |
| 2018-03-28 | 1135 | 657 | 473 |
| 2018-03-29 | 1135 | 657 | 473 |
| 2018-03-30 | 1135 | 657 | 473 |
| 2018-03-31 | 1135 | 657 | 473 |
| 2018-04-01 | 1135 | 657 | 473 |
| 2018-04-02 | 1135 | 657 | 473 |
| 2018-04-03 | 1135 | 657 | 473 |
| 2018-04-04 | 1135 | 657 | 473 |
| 2018-04-05 | 1135 | 657 | 473 |
| 2018-04-06 | 1135 | 657 | 473 |
| 2018-04-07 | 1135 | 657 | 473 |
| 2018-04-08 | 1135 | 657 | 473 |
| 2018-04-09 | 1135 | 657 | 473 |
| 2018-04-10 | 1135 | 657 | 473 |
| 2018-04-11 | 1135 | 657 | 473 |
| 2018-04-12 | 1135 | 657 | 473 |
| 2018-04-13 | 1135 | 657 | 473 |
| 2018-04-14 | 1135 | 657 | 473 |
| 2018-04-15 | 1135 | 657 | 473 |
| 2018-04-16 | 1135 | 657 | 473 |
| 2018-04-17 | 1135 | 657 | 473 |
| 2018-04-18 | 1135 | 657 | 473 |
| 2018-04-19 | 1135 | 657 | 473 |
| 2018-04-20 | 1135 | 657 | 473 |
| 2018-04-21 | 1135 | 657 | 473 |
| 2018-04-22 | 1135 | 657 | 473 |
| 2018-04-23 | 1135 | 657 | 473 |
| 2018-04-24 | 1135 | 657 | 473 |
| 2018-04-25 | 1135 | 657 | 473 |
| 2018-04-26 | 1135 | 657 | 473 |
| 2018-04-27 | 1135 | 657 | 473 |
| 2018-04-28 | 1135 | 657 | 473 |
| 2018-04-29 | 1135 | 657 | 473 |
| 2018-04-30 | 1135 | 657 | 473 |
| 2018-05-01 | 1135 | 657 | 473 |
| 2018-05-02 | 1135 | 657 | 473 |
| 2018-05-03 | 1135 | 657 | 473 |
| 2018-05-04 | 1135 | 657 | 473 |
| 2018-05-05 | 1135 | 657 | 473 |
| 2018-05-06 | 1135 | 657 | 473 |
| 2018-05-07 | 1135 | 657 | 473 |
| 2018-05-08 | 1135 | 657 | 473 |
| 2018-05-09 | 1135 | 657 | 473 |
| 2018-05-10 | 1135 | 657 | 473 |
| 2018-05-11 | 1135 | 657 | 473 |
| 2018-05-12 | 1135 | 657 | 473 |
| 2018-05-13 | 1135 | 657 | 473 |
| 2018-05-14 | 1135 | 657 | 473 |
| 2018-05-15 | 1135 | 657 | 473 |
| 2018-05-16 | 1135 | 657 | 473 |
| 2018-05-17 | 1135 | 657 | 473 |
| 2018-05-18 | 1135 | 657 | 473 |
| 2018-05-19 | 1135 | 657 | 473 |
| 2018-05-20 | 1135 | 657 | 473 |
| 2018-05-21 | 1135 | 657 | 473 |
| 2018-05-22 | 1135 | 657 | 473 |
| 2018-05-23 | 1135 | 657 | 473 |
| 2018-05-24 | 1135 | 657 | 473 |
| 2018-05-25 | 1135 | 657 | 473 |
| 2018-05-26 | 1135 | 657 | 473 |
| 2018-05-27 | 1135 | 657 | 473 |
| 2018-05-28 | 1135 | 657 | 473 |
| 2018-05-29 | 1135 | 657 | 473 |
| 2018-05-30 | 1135 | 657 | 473 |
| 2018-05-31 | 1135 | 657 | 473 |
| 2018-06-01 | 1135 | 657 | 473 |
| 2018-06-02 | 1135 | 657 | 473 |
| 2018-06-03 | 1135 | 657 | 473 |
| 2018-06-04 | 1135 | 657 | 473 |
| 2018-06-05 | 1135 | 657 | 473 |
| 2018-06-06 | 1135 | 657 | 473 |
| 2018-06-07 | 1135 | 657 | 473 |
| 2018-06-08 | 1135 | 657 | 473 |
| 2018-06-09 | 1135 | 657 | 473 |
| 2018-06-10 | 1135 | 657 | 473 |
| 2018-06-11 | 1135 | 657 | 473 |
| 2018-06-12 | 1135 | 657 | 473 |
| 2018-06-13 | 1135 | 657 | 473 |
| 2018-06-14 | 1135 | 657 | 473 |
| 2018-06-15 | 1135 | 657 | 473 |
| 2018-06-16 | 1135 | 657 | 473 |
| 2018-06-17 | 1135 | 657 | 473 |
| 2018-06-18 | 1135 | 657 | 473 |
| 2018-06-19 | 1135 | 657 | 473 |
| 2018-06-20 | 1135 | 657 | 473 |
| 2018-06-21 | 1135 | 657 | 473 |
| 2018-06-22 | 1135 | 657 | 473 |
| 2018-06-23 | 1135 | 657 | 473 |
| 2018-06-24 | 1135 | 657 | 473 |
| 2018-06-25 | 1135 | 657 | 473 |
| 2018-06-26 | 1135 | 657 | 473 |
| 2018-06-27 | 1135 | 657 | 473 |
| 2018-06-28 | 1135 | 657 | 473 |
| 2018-06-29 | 1135 | 657 | 473 |
| 2018-06-30 | 1135 | 657 | 473 |
| 2018-07-01 | 1135 | 657 | 473 |
| 2018-07-02 | 1135 | 657 | 473 |
| 2018-07-03 | 1135 | 657 | 473 |
| 2018-07-04 | 1135 | 657 | 473 |
| 2018-07-05 | 1135 | 657 | 473 |
| 2018-07-06 | 1135 | 657 | 473 |
| 2018-07-07 | 1135 | 657 | 473 |
| 2018-07-08 | 1135 | 657 | 473 |
| 2018-07-09 | 1135 | 657 | 473 |
| 2018-07-10 | 1135 | 657 | 473 |
| 2018-07-11 | 1135 | 657 | 473 |
| 2018-07-12 | 1135 | 657 | 473 |
| 2018-07-13 | 1135 | 657 | 473 |
| 2018-07-14 | 1135 | 657 | 473 |
| 2018-07-15 | 1135 | 657 | 473 |
| 2018-07-16 | 1135 | 657 | 473 |
| 2018-07-17 | 1135 | 657 | 473 |
| 2018-07-18 | 1135 | 657 | 473 |
| 2018-07-19 | 1135 | 657 | 473 |
| 2018-07-20 | 1135 | 657 | 473 |
| 2018-07-21 | 1135 | 657 | 473 |
| 2018-07-22 | 1135 | 657 | 473 |
| 2018-07-23 | 1135 | 657 | 473 |
| 2018-07-24 | 1135 | 657 | 473 |
| 2018-07-25 | 1135 | 657 | 473 |
| 2018-07-26 | 1135 | 657 | 473 |
| 2018-07-27 | 1135 | 657 | 473 |
| 2018-07-28 | 1135 | 657 | 473 |
| 2018-07-29 | 1135 | 657 | 473 |
| 2018-07-30 | 1135 | 657 | 473 |
| 2018-07-31 | 1135 | 657 | 473 |
| 2018-08-01 | 1135 | 657 | 473 |
| 2018-08-02 | 1135 | 657 | 473 |
| 2018-08-03 | 1135 | 657 | 472 |
| 2018-08-04 | 1135 | 657 | 472 |
| 2018-08-05 | 1135 | 657 | 472 |
| 2018-08-06 | 1135 | 657 | 472 |
| 2018-08-07 | 1135 | 657 | 472 |
| 2018-08-08 | 1135 | 657 | 472 |
| 2018-08-09 | 1135 | 657 | 472 |
| 2018-08-10 | 1135 | 657 | 472 |
| 2018-08-11 | 1135 | 657 | 472 |
| 2018-08-12 | 1135 | 657 | 472 |
| 2018-08-13 | 1135 | 657 | 472 |
| 2018-08-14 | 1135 | 658 | 473 |
| 2018-08-15 | 1135 | 658 | 473 |
| 2018-08-16 | 1135 | 658 | 473 |
| 2018-08-17 | 1135 | 658 | 473 |
| 2018-08-18 | 1135 | 658 | 473 |
| 2018-08-19 | 1135 | 658 | 473 |
| 2018-08-20 | 1135 | 658 | 473 |
| 2018-08-21 | 1135 | 658 | 473 |
| 2018-08-22 | 1135 | 658 | 473 |
| 2018-08-23 | 1135 | 658 | 473 |
| 2018-08-24 | 1135 | 658 | 473 |
| 2018-08-25 | 1135 | 658 | 473 |
| 2018-08-26 | 1135 | 658 | 473 |
| 2018-08-27 | 1135 | 658 | 473 |
| 2018-08-28 | 1135 | 658 | 473 |
| 2018-08-29 | 1135 | 658 | 473 |
| 2018-08-30 | 1135 | 658 | 473 |
| 2018-08-31 | 1135 | 658 | 473 |
| 2018-09-01 | 1135 | 658 | 473 |
| 2018-09-02 | 1135 | 658 | 473 |
| 2018-09-03 | 1135 | 658 | 473 |
| 2018-09-04 | 1135 | 658 | 473 |
| 2018-09-05 | 1135 | 658 | 473 |
| 2018-09-06 | 1135 | 658 | 473 |
| 2018-09-07 | 1135 | 658 | 473 |
| 2018-09-08 | 1135 | 658 | 473 |
| 2018-09-09 | 1135 | 658 | 473 |
| 2018-09-10 | 1135 | 658 | 473 |
| 2018-09-11 | 1135 | 658 | 473 |
| 2018-09-12 | 1135 | 658 | 473 |
| 2018-09-13 | 1135 | 658 | 473 |
| 2018-09-14 | 1135 | 658 | 473 |
| 2018-09-15 | 1135 | 658 | 473 |
| 2018-09-16 | 1135 | 658 | 473 |
| 2018-09-17 | 1135 | 658 | 473 |
| 2018-09-18 | 1135 | 658 | 473 |
| 2018-09-19 | 1135 | 658 | 473 |
| 2018-09-20 | 1135 | 658 | 473 |
| 2018-09-21 | 1135 | 658 | 473 |
| 2018-09-22 | 1135 | 658 | 473 |
| 2018-09-23 | 1135 | 658 | 473 |
| 2018-09-24 | 1135 | 658 | 473 |
| 2018-09-25 | 1135 | 658 | 473 |
| 2018-09-26 | 1135 | 658 | 473 |
| 2018-09-27 | 1135 | 658 | 473 |
| 2018-09-28 | 1135 | 658 | 473 |
| 2018-09-29 | 1135 | 658 | 473 |
| 2018-09-30 | 1135 | 658 | 473 |
| 2018-10-01 | 1135 | 658 | 473 |
| 2018-10-02 | 1135 | 658 | 473 |
| 2018-10-03 | 1135 | 658 | 473 |
| 2018-10-04 | 1135 | 658 | 473 |
| 2018-10-05 | 1135 | 658 | 473 |
| 2018-10-06 | 1135 | 658 | 473 |
| 2018-10-07 | 1135 | 658 | 473 |
| 2018-10-08 | 1135 | 658 | 473 |
| 2018-10-09 | 1135 | 658 | 473 |
| 2018-10-10 | 1135 | 658 | 473 |
| 2018-10-11 | 1135 | 658 | 473 |
| 2018-10-12 | 1135 | 658 | 473 |
| 2018-10-13 | 1135 | 658 | 473 |
| 2018-10-14 | 1135 | 658 | 473 |
| 2018-10-15 | 1135 | 658 | 473 |
| 2018-10-16 | 1135 | 658 | 473 |
| 2018-10-17 | 1135 | 658 | 473 |
| 2018-10-18 | 1135 | 658 | 473 |
| 2018-10-19 | 1135 | 658 | 473 |
| 2018-10-20 | 1135 | 658 | 473 |
| 2018-10-21 | 1135 | 658 | 473 |
| 2018-10-22 | 1135 | 658 | 473 |
| 2018-10-23 | 1135 | 658 | 473 |
| 2018-10-24 | 1135 | 658 | 473 |
| 2018-10-25 | 1135 | 658 | 473 |
| 2018-10-26 | 1135 | 658 | 473 |
| 2018-10-27 | 1135 | 658 | 473 |
| 2018-10-28 | 1135 | 658 | 473 |
| 2018-10-29 | 1135 | 658 | 473 |
| 2018-10-30 | 1135 | 658 | 473 |
| 2018-10-31 | 1135 | 658 | 473 |
| 2018-11-01 | 1135 | 658 | 474 |
| 2018-11-02 | 1135 | 658 | 474 |
| 2018-11-03 | 1135 | 658 | 474 |
| 2018-11-04 | 1135 | 658 | 474 |
| 2018-11-05 | 1135 | 658 | 474 |
| 2018-11-06 | 1135 | 658 | 474 |
| 2018-11-07 | 1135 | 658 | 474 |
| 2018-11-08 | 1135 | 658 | 474 |
| 2018-11-09 | 1135 | 658 | 474 |
| 2018-11-10 | 1135 | 658 | 474 |
| 2018-11-11 | 1135 | 621 | 444 |
| 2018-11-12 | 1135 | 621 | 444 |
| 2018-11-13 | 1135 | 621 | 444 |
| 2018-11-14 | 1135 | 621 | 444 |
| 2018-11-15 | 1135 | 621 | 444 |
| 2018-11-16 | 1135 | 621 | 444 |
| 2018-11-17 | 1135 | 621 | 444 |
| 2018-11-18 | 1135 | 621 | 444 |
| 2018-11-19 | 1135 | 621 | 443 |
| 2018-11-20 | 1135 | 621 | 443 |
| 2018-11-21 | 1135 | 621 | 443 |
| 2018-11-22 | 1135 | 620 | 443 |
| 2018-11-23 | 1135 | 620 | 443 |
| 2018-11-24 | 1135 | 620 | 443 |
| 2018-11-25 | 1135 | 620 | 443 |
| 2018-11-26 | 1135 | 620 | 443 |
| 2018-11-27 | 1135 | 620 | 443 |
| 2018-11-28 | 1133 | 620 | 443 |
| 2018-11-29 | 1132 | 620 | 443 |
| 2018-11-30 | 1132 | 619 | 443 |
| 2018-12-01 | 1132 | 619 | 443 |
| 2018-12-02 | 1132 | 619 | 443 |
| 2018-12-03 | 1132 | 619 | 443 |
| 2018-12-04 | 1132 | 619 | 443 |
| 2018-12-05 | 1132 | 619 | 443 |
| 2018-12-06 | 1132 | 619 | 443 |
| 2018-12-07 | 1132 | 618 | 443 |
| 2018-12-08 | 1132 | 618 | 443 |
| 2018-12-09 | 1132 | 618 | 443 |
| 2018-12-10 | 1132 | 618 | 443 |
| 2018-12-11 | 1132 | 618 | 443 |
| 2018-12-12 | 1131 | 617 | 443 |
| 2018-12-13 | 1130 | 617 | 443 |
| 2018-12-14 | 1130 | 616 | 443 |
| 2018-12-15 | 1130 | 616 | 443 |
| 2018-12-16 | 1130 | 616 | 443 |
| 2018-12-17 | 1130 | 616 | 442 |
| 2018-12-18 | 1130 | 616 | 442 |
| 2018-12-19 | 1129 | 616 | 442 |
| 2018-12-20 | 1129 | 614 | 442 |
| 2018-12-21 | 1129 | 614 | 442 |
| 2018-12-22 | 1129 | 614 | 442 |
| 2018-12-23 | 1129 | 614 | 442 |
| 2018-12-24 | 1129 | 613 | 442 |
| 2018-12-25 | 1129 | 613 | 442 |
| 2018-12-26 | 1129 | 613 | 442 |
| 2018-12-27 | 1129 | 613 | 442 |
| 2018-12-28 | 1129 | 612 | 442 |
| 2018-12-29 | 1129 | 612 | 442 |
| 2018-12-30 | 1129 | 612 | 442 |
| 2018-12-31 | 1126 | 612 | 442 |
| 2019-01-01 | 1126 | 612 | 442 |
| 2019-01-02 | 1126 | 612 | 442 |
| 2019-01-03 | 1125 | 612 | 442 |
| 2019-01-04 | 1125 | 611 | 442 |
| 2019-01-05 | 1125 | 611 | 442 |
| 2019-01-06 | 1125 | 611 | 442 |
| 2019-01-07 | 1125 | 611 | 442 |
| 2019-01-08 | 1125 | 611 | 442 |
| 2019-01-09 | 1124 | 611 | 442 |
| 2019-01-10 | 1124 | 611 | 442 |
| 2019-01-11 | 1124 | 611 | 442 |
| 2019-01-12 | 1124 | 611 | 442 |
| 2019-01-13 | 1124 | 611 | 442 |
| 2019-01-14 | 1124 | 611 | 442 |
| 2019-01-15 | 1124 | 611 | 442 |
| 2019-01-16 | 1124 | 611 | 442 |
| 2019-01-17 | 1124 | 611 | 442 |
| 2019-01-18 | 1124 | 611 | 442 |
| 2019-01-19 | 1124 | 611 | 442 |
| 2019-01-20 | 1124 | 611 | 442 |
| 2019-01-21 | 1123 | 611 | 442 |
| 2019-01-22 | 1123 | 611 | 442 |
| 2019-01-23 | 1123 | 611 | 442 |
| 2019-01-24 | 1123 | 611 | 442 |
| 2019-01-25 | 1121 | 610 | 442 |
| 2019-01-26 | 1121 | 610 | 442 |
| 2019-01-27 | 1121 | 610 | 442 |
| 2019-01-28 | 1121 | 610 | 442 |
| 2019-01-29 | 1121 | 610 | 442 |
| 2019-01-30 | 1121 | 610 | 442 |
| 2019-01-31 | 1121 | 609 | 441 |
| 2019-02-01 | 1121 | 609 | 441 |
| 2019-02-02 | 1121 | 609 | 441 |
| 2019-02-03 | 1121 | 609 | 441 |
| 2019-02-04 | 1121 | 609 | 440 |
| 2019-02-05 | 1121 | 609 | 440 |
| 2019-02-06 | 1120 | 609 | 440 |
| 2019-02-07 | 1120 | 609 | 440 |
| 2019-02-08 | 1119 | 609 | 440 |
| 2019-02-09 | 1119 | 609 | 440 |
| 2019-02-10 | 1119 | 609 | 440 |
| 2019-02-11 | 1119 | 609 | 440 |
| 2019-02-12 | 1119 | 609 | 440 |
| 2019-02-13 | 1119 | 609 | 440 |
| 2019-02-14 | 1119 | 609 | 440 |
| 2019-02-15 | 1118 | 609 | 440 |
| 2019-02-16 | 1118 | 609 | 440 |
| 2019-02-17 | 1118 | 609 | 440 |
| 2019-02-18 | 1118 | 609 | 440 |
| 2019-02-19 | 1118 | 609 | 440 |
| 2019-02-20 | 1118 | 609 | 440 |
| 2019-02-21 | 1118 | 609 | 440 |
| 2019-02-22 | 1118 | 609 | 440 |
| 2019-02-23 | 1118 | 609 | 440 |
| 2019-02-24 | 1118 | 609 | 440 |
| 2019-02-25 | 1118 | 609 | 440 |
| 2019-02-26 | 1118 | 609 | 440 |
| 2019-02-27 | 1118 | 609 | 440 |
| 2019-02-28 | 1117 | 609 | 440 |
| 2019-03-01 | 1117 | 608 | 440 |
| 2019-03-02 | 1117 | 608 | 440 |
| 2019-03-03 | 1117 | 608 | 440 |
| 2019-03-04 | 1116 | 608 | 440 |
| 2019-03-05 | 1116 | 608 | 440 |
| 2019-03-06 | 1116 | 608 | 440 |
| 2019-03-07 | 1116 | 608 | 440 |
| 2019-03-08 | 1116 | 608 | 440 |
| 2019-03-09 | 1116 | 608 | 440 |
| 2019-03-10 | 1116 | 608 | 440 |
| 2019-03-11 | 1116 | 608 | 440 |
| 2019-03-12 | 1116 | 608 | 440 |
| 2019-03-13 | 1116 | 608 | 440 |
| 2019-03-14 | 1116 | 608 | 440 |
| 2019-03-15 | 1116 | 608 | 440 |
| 2019-03-16 | 1116 | 608 | 440 |
| 2019-03-17 | 1116 | 608 | 440 |
| 2019-03-18 | 1116 | 608 | 440 |
| 2019-03-19 | 1116 | 608 | 440 |
| 2019-03-20 | 1116 | 608 | 440 |
| 2019-03-21 | 1116 | 608 | 440 |
| 2019-03-22 | 1116 | 608 | 440 |
| 2019-03-23 | 1116 | 608 | 440 |
| 2019-03-24 | 1116 | 608 | 440 |
| 2019-03-25 | 1116 | 608 | 440 |
| 2019-03-26 | 1116 | 608 | 440 |
| 2019-03-27 | 1116 | 608 | 440 |
| 2019-03-28 | 1116 | 608 | 440 |
| 2019-03-29 | 1116 | 608 | 439 |
| 2019-03-30 | 1115 | 608 | 439 |
| 2019-03-31 | 1115 | 608 | 439 |
| 2019-04-01 | 1115 | 608 | 439 |
| 2019-04-02 | 1115 | 608 | 439 |
| 2019-04-03 | 1115 | 608 | 439 |
| 2019-04-04 | 1115 | 608 | 439 |
| 2019-04-05 | 1115 | 608 | 439 |
| 2019-04-06 | 1114 | 608 | 439 |
| 2019-04-07 | 1114 | 608 | 439 |
| 2019-04-08 | 1114 | 608 | 439 |
| 2019-04-09 | 1114 | 608 | 439 |
| 2019-04-10 | 1114 | 608 | 439 |
| 2019-04-11 | 1114 | 608 | 439 |
| 2019-04-12 | 1114 | 608 | 439 |
| 2019-04-13 | 1114 | 608 | 439 |
| 2019-04-14 | 1114 | 608 | 439 |
| 2019-04-15 | 1114 | 608 | 439 |
| 2019-04-16 | 1113 | 608 | 439 |
| 2019-04-17 | 1113 | 608 | 439 |
| 2019-04-18 | 1113 | 608 | 439 |
| 2019-04-19 | 1113 | 608 | 439 |
| 2019-04-20 | 1113 | 608 | 439 |
| 2019-04-21 | 1113 | 608 | 439 |
| 2019-04-22 | 1113 | 608 | 439 |
| 2019-04-23 | 1113 | 608 | 439 |
| 2019-04-24 | 1113 | 607 | 439 |
| 2019-04-25 | 1113 | 607 | 439 |
| 2019-04-26 | 1112 | 607 | 439 |
| 2019-04-27 | 1111 | 607 | 439 |
| 2019-04-28 | 1111 | 607 | 439 |
| 2019-04-29 | 1111 | 607 | 439 |
| 2019-04-30 | 1111 | 606 | 439 |